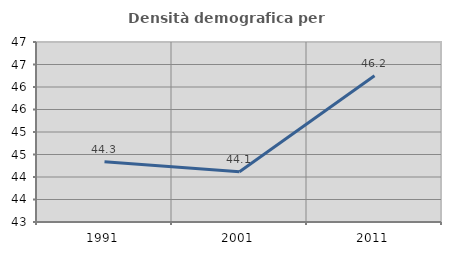
| Category | Densità demografica |
|---|---|
| 1991.0 | 44.341 |
| 2001.0 | 44.115 |
| 2011.0 | 46.249 |